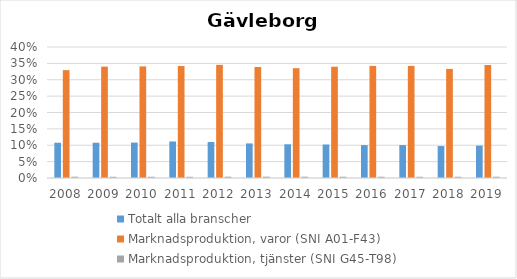
| Category | Totalt alla branscher | Marknadsproduktion, varor (SNI A01-F43) | Marknadsproduktion, tjänster (SNI G45-T98) |
|---|---|---|---|
| 2008.0 | 0.108 | 0.329 | 0.004 |
| 2009.0 | 0.108 | 0.34 | 0.004 |
| 2010.0 | 0.108 | 0.341 | 0.004 |
| 2011.0 | 0.111 | 0.342 | 0.004 |
| 2012.0 | 0.11 | 0.345 | 0.004 |
| 2013.0 | 0.106 | 0.339 | 0.004 |
| 2014.0 | 0.103 | 0.335 | 0.004 |
| 2015.0 | 0.102 | 0.34 | 0.004 |
| 2016.0 | 0.1 | 0.342 | 0.004 |
| 2017.0 | 0.101 | 0.342 | 0.004 |
| 2018.0 | 0.098 | 0.333 | 0.004 |
| 2019.0 | 0.099 | 0.345 | 0.004 |